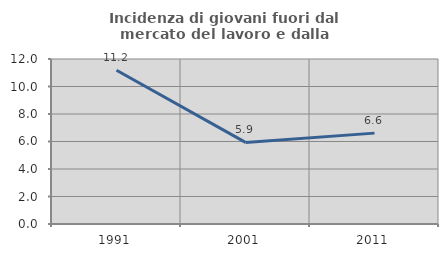
| Category | Incidenza di giovani fuori dal mercato del lavoro e dalla formazione  |
|---|---|
| 1991.0 | 11.186 |
| 2001.0 | 5.935 |
| 2011.0 | 6.609 |